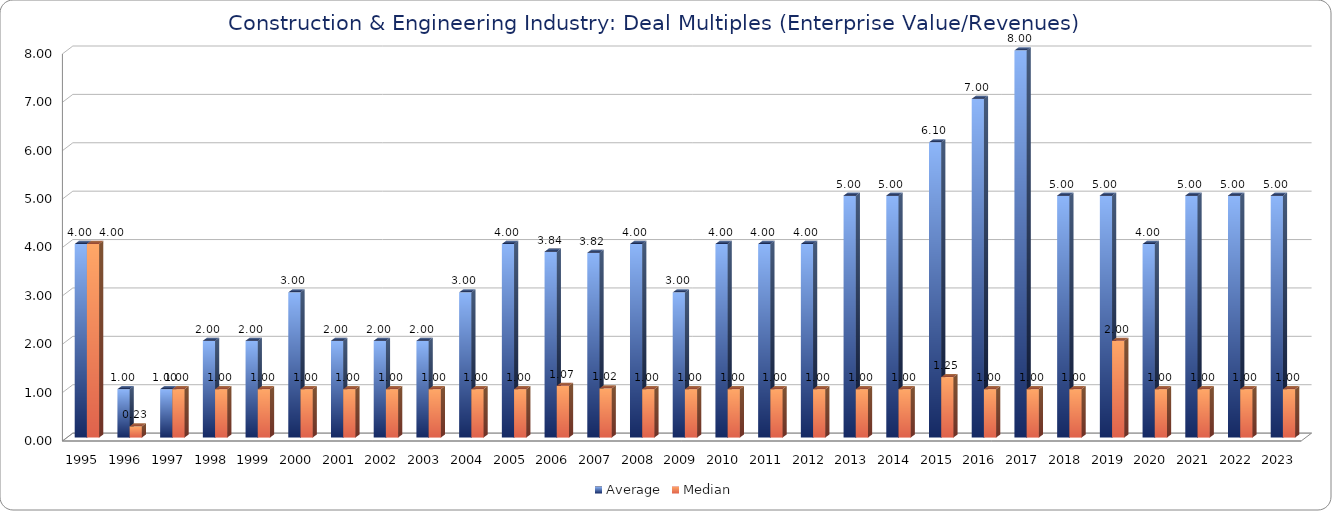
| Category | Average | Median |
|---|---|---|
| 1995.0 | 4 | 4 |
| 1996.0 | 1 | 0.231 |
| 1997.0 | 1 | 1 |
| 1998.0 | 2 | 1 |
| 1999.0 | 2 | 1 |
| 2000.0 | 3 | 1 |
| 2001.0 | 2 | 1 |
| 2002.0 | 2 | 1 |
| 2003.0 | 2 | 1 |
| 2004.0 | 3 | 1 |
| 2005.0 | 4 | 1 |
| 2006.0 | 3.841 | 1.07 |
| 2007.0 | 3.818 | 1.015 |
| 2008.0 | 4 | 1 |
| 2009.0 | 3 | 1 |
| 2010.0 | 4 | 1 |
| 2011.0 | 4 | 1 |
| 2012.0 | 4 | 1 |
| 2013.0 | 5 | 1 |
| 2014.0 | 5 | 1 |
| 2015.0 | 6.102 | 1.25 |
| 2016.0 | 7 | 1 |
| 2017.0 | 8 | 1 |
| 2018.0 | 5 | 1 |
| 2019.0 | 5 | 2 |
| 2020.0 | 4 | 1 |
| 2021.0 | 5 | 1 |
| 2022.0 | 5 | 1 |
| 2023.0 | 5 | 1 |